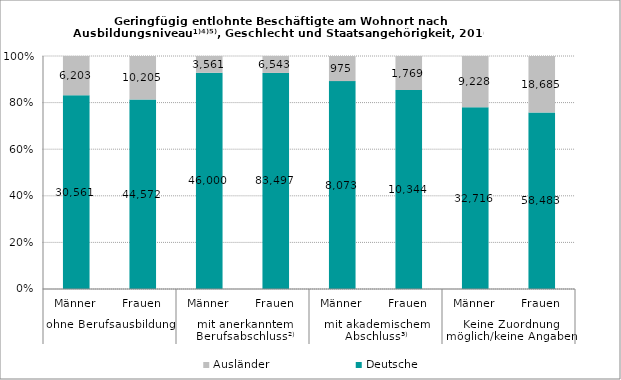
| Category | Deutsche | Ausländer |
|---|---|---|
| 0 | 30561 | 6203 |
| 1 | 44572 | 10205 |
| 2 | 46000 | 3561 |
| 3 | 83497 | 6543 |
| 4 | 8073 | 975 |
| 5 | 10344 | 1769 |
| 6 | 32716 | 9228 |
| 7 | 58483 | 18685 |